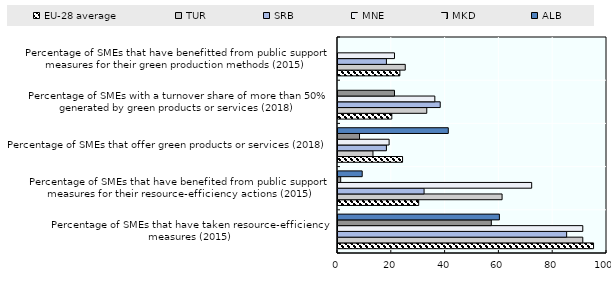
| Category | EU-28 average | TUR | SRB | MNE | MKD | ALB |
|---|---|---|---|---|---|---|
| Percentage of SMEs that have taken resource-efficiency measures (2015) | 95 | 91 | 85 | 91 | 57 | 60 |
| Percentage of SMEs that have benefited from public support measures for their resource-efficiency actions (2015) | 30 | 61 | 32 | 72 | 1 | 9 |
| Percentage of SMEs that offer green products or services (2018) | 24 | 13 | 18 | 19 | 8 | 41 |
| Percentage of SMEs with a turnover share of more than 50% generated by green products or services (2018) | 20 | 33 | 38 | 36 | 21 | 0 |
| Percentage of SMEs that have benefitted from public support measures for their green production methods (2015) | 23 | 25 | 18 | 21 | 0 | 0 |